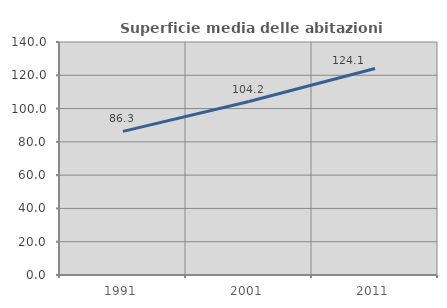
| Category | Superficie media delle abitazioni occupate |
|---|---|
| 1991.0 | 86.293 |
| 2001.0 | 104.218 |
| 2011.0 | 124.091 |